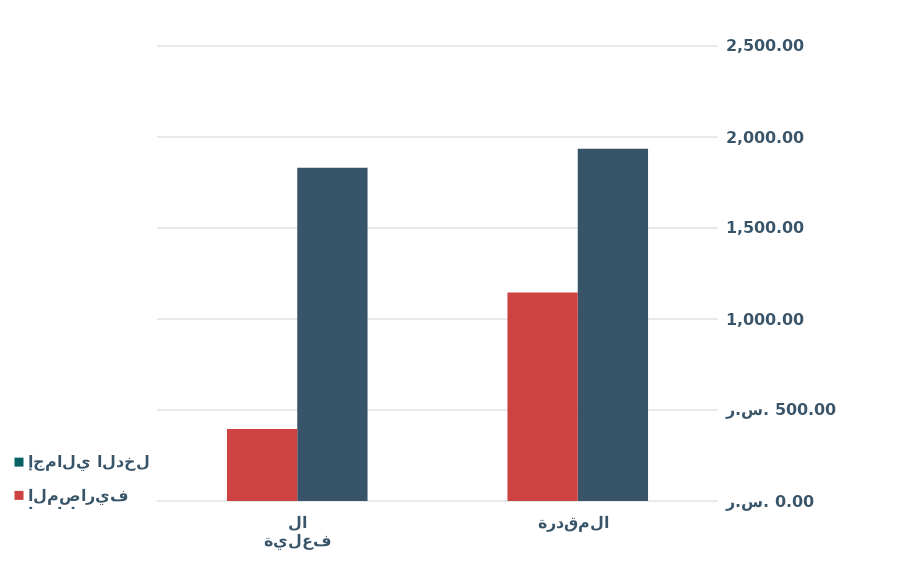
| Category | إجمالي الدخل | إجمالي المصاريف |
|---|---|---|
| 0 | 1936 | 1145 |
| 1 | 1831 | 395 |